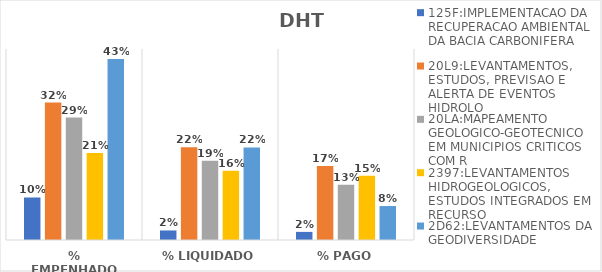
| Category | 125F:IMPLEMENTACAO DA RECUPERACAO AMBIENTAL DA BACIA CARBONIFERA | 20L9:LEVANTAMENTOS, ESTUDOS, PREVISAO E ALERTA DE EVENTOS HIDROLO | 20LA:MAPEAMENTO GEOLOGICO-GEOTECNICO EM MUNICIPIOS CRITICOS COM R | 2397:LEVANTAMENTOS HIDROGEOLOGICOS, ESTUDOS INTEGRADOS EM RECURSO | 2D62:LEVANTAMENTOS DA GEODIVERSIDADE |
|---|---|---|---|---|---|
| % EMPENHADO | 0.1 | 0.324 | 0.288 | 0.205 | 0.427 |
| % LIQUIDADO | 0.022 | 0.218 | 0.187 | 0.163 | 0.218 |
| % PAGO | 0.019 | 0.174 | 0.13 | 0.152 | 0.08 |